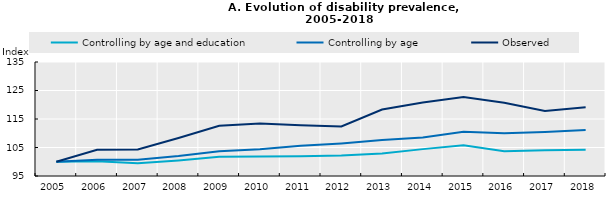
| Category | Controlling by age and education | Controlling by age  | Observed |
|---|---|---|---|
| 2005.0 | 100 | 100 | 100 |
| 2006.0 | 100.132 | 100.684 | 104.179 |
| 2007.0 | 99.48 | 100.725 | 104.295 |
| 2008.0 | 100.471 | 102.036 | 108.349 |
| 2009.0 | 101.712 | 103.695 | 112.656 |
| 2010.0 | 101.822 | 104.4 | 113.439 |
| 2011.0 | 101.893 | 105.572 | 112.781 |
| 2012.0 | 102.183 | 106.44 | 112.392 |
| 2013.0 | 102.861 | 107.592 | 118.327 |
| 2014.0 | 104.429 | 108.506 | 120.755 |
| 2015.0 | 105.782 | 110.532 | 122.711 |
| 2016.0 | 103.663 | 109.969 | 120.7 |
| 2017.0 | 104.02 | 110.453 | 117.846 |
| 2018.0 | 104.182 | 111.161 | 119.148 |